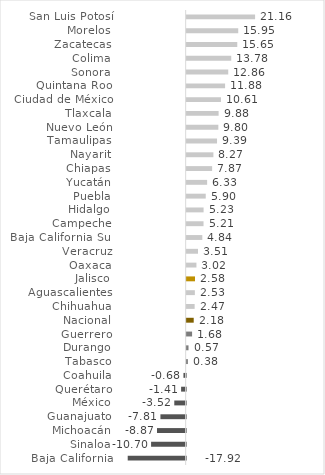
| Category | Series 0 |
|---|---|
| Baja California | -17.922 |
| Sinaloa | -10.697 |
| Michoacán | -8.866 |
| Guanajuato | -7.809 |
| México | -3.522 |
| Querétaro | -1.411 |
| Coahuila | -0.684 |
| Tabasco | 0.378 |
| Durango | 0.57 |
| Guerrero | 1.677 |
| Nacional | 2.179 |
| Chihuahua | 2.467 |
| Aguascalientes | 2.535 |
| Jalisco | 2.581 |
| Oaxaca | 3.025 |
| Veracruz | 3.507 |
| Baja California Sur | 4.837 |
| Campeche | 5.213 |
| Hidalgo | 5.233 |
| Puebla | 5.895 |
| Yucatán | 6.33 |
| Chiapas | 7.871 |
| Nayarit | 8.267 |
| Tamaulipas | 9.389 |
| Nuevo León | 9.796 |
| Tlaxcala | 9.879 |
| Ciudad de México | 10.606 |
| Quintana Roo | 11.884 |
| Sonora | 12.856 |
| Colima | 13.782 |
| Zacatecas | 15.65 |
| Morelos | 15.945 |
| San Luis Potosí | 21.158 |